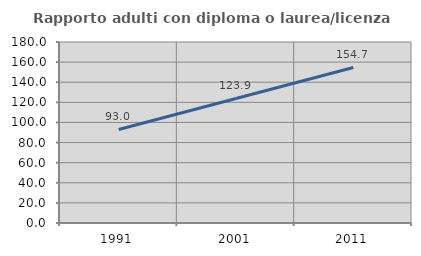
| Category | Rapporto adulti con diploma o laurea/licenza media  |
|---|---|
| 1991.0 | 93.034 |
| 2001.0 | 123.851 |
| 2011.0 | 154.684 |